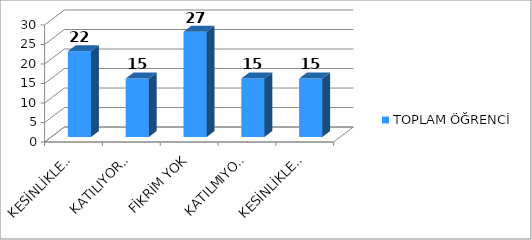
| Category | TOPLAM ÖĞRENCİ |
|---|---|
| KESİNLİKLE KATILIYORUM | 22 |
| KATILIYORUM | 15 |
| FİKRİM YOK | 27 |
| KATILMIYORUM | 15 |
| KESİNLİKLE KATILMIYORUM | 15 |